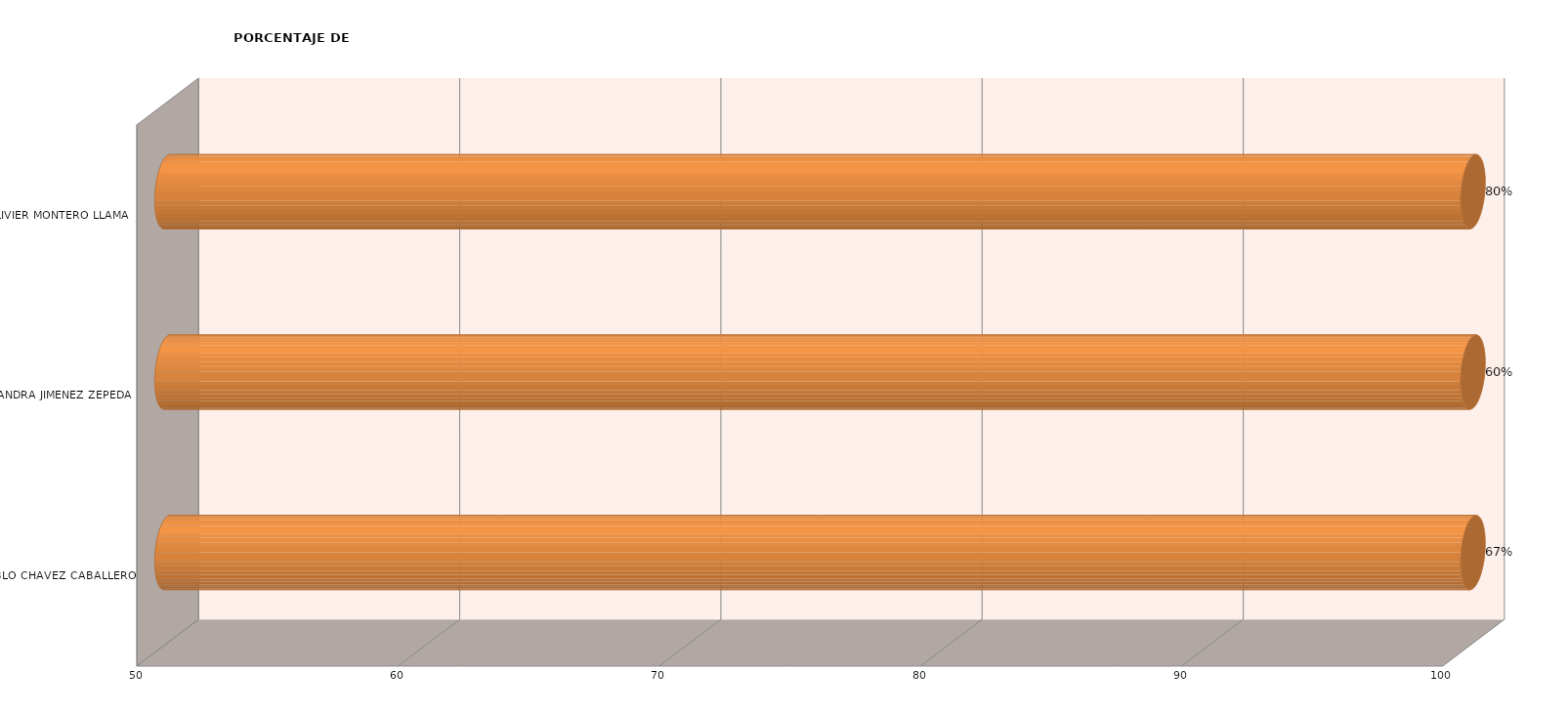
| Category | Series 0 |
|---|---|
| JUAN PABLO CHAVEZ CABALLERO | 100 |
| ALEJANDRA JIMENEZ ZEPEDA | 100 |
| MARIA DE JESUS LIVIER MONTERO LLAMAS | 100 |